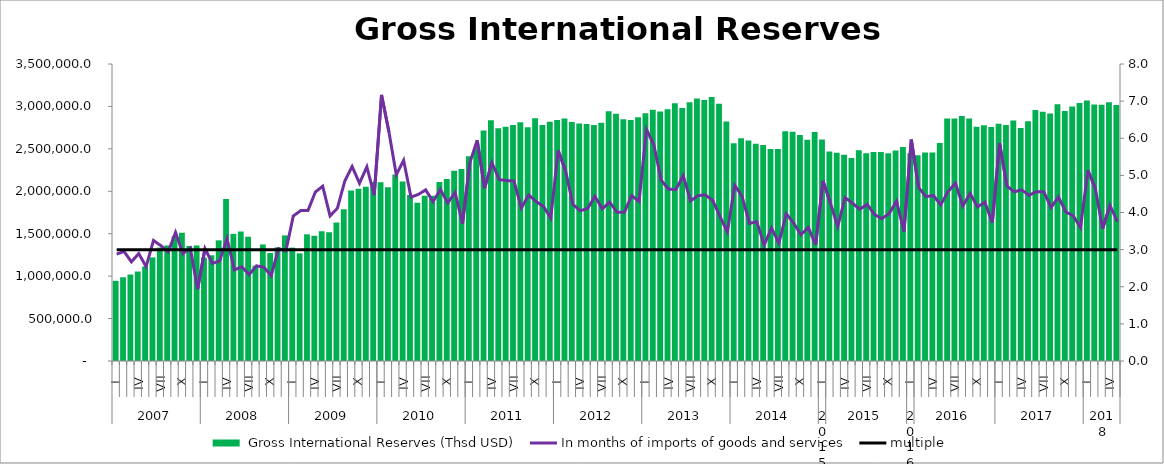
| Category |  Gross International Reserves (Thsd USD) |
|---|---|
| 0 | 944569.356 |
| 1 | 986716.087 |
| 2 | 1018970.638 |
| 3 | 1054278.365 |
| 4 | 1114160.468 |
| 5 | 1220729.487 |
| 6 | 1336062.499 |
| 7 | 1360970.198 |
| 8 | 1469799.647 |
| 9 | 1510431.083 |
| 10 | 1355160.588 |
| 11 | 1361139.94 |
| 12 | 1218380.992 |
| 13 | 1245880.818 |
| 14 | 1421919.99 |
| 15 | 1910253.845 |
| 16 | 1497582.718 |
| 17 | 1526134.644 |
| 18 | 1464749.428 |
| 19 | 1122855.834 |
| 20 | 1373330.153 |
| 21 | 1272102.001 |
| 22 | 1339757.483 |
| 23 | 1480157.563 |
| 24 | 1335830.434 |
| 25 | 1269325.862 |
| 26 | 1493108.058 |
| 27 | 1476027.716 |
| 28 | 1530375.506 |
| 29 | 1518203.703 |
| 30 | 1632579.525 |
| 31 | 1788341.435 |
| 32 | 2009955.589 |
| 33 | 2030508.619 |
| 34 | 2052635.598 |
| 35 | 2110413.479 |
| 36 | 2106203.981 |
| 37 | 2046269.085 |
| 38 | 2199234.144 |
| 39 | 2116174.036 |
| 40 | 1957092.26 |
| 41 | 1864408.87 |
| 42 | 1947257.286 |
| 43 | 1948646.735 |
| 44 | 2110240.516 |
| 45 | 2143452.411 |
| 46 | 2243098.08 |
| 47 | 2263931.003 |
| 48 | 2413276.234 |
| 49 | 2519379.834 |
| 50 | 2717701.26 |
| 51 | 2838315.136 |
| 52 | 2741576.745 |
| 53 | 2759253.793 |
| 54 | 2782237.942 |
| 55 | 2813452.719 |
| 56 | 2755211.768 |
| 57 | 2861887.778 |
| 58 | 2780195.98 |
| 59 | 2818259.268 |
| 60 | 2839594.988 |
| 61 | 2856750.893 |
| 62 | 2816704.829 |
| 63 | 2798459.455 |
| 64 | 2793387.554 |
| 65 | 2780985.069 |
| 66 | 2807413.792 |
| 67 | 2943749.499 |
| 68 | 2914658.817 |
| 69 | 2849332.726 |
| 70 | 2841471.603 |
| 71 | 2872974.007 |
| 72 | 2920913.483 |
| 73 | 2960164.648 |
| 74 | 2941281.374 |
| 75 | 2967640.231 |
| 76 | 3038439.423 |
| 77 | 2981696.572 |
| 78 | 3048940.273 |
| 79 | 3094880.401 |
| 80 | 3074514.403 |
| 81 | 3110052.596 |
| 82 | 3030762.59 |
| 83 | 2823422.31 |
| 84 | 2566485.807 |
| 85 | 2625815.897 |
| 86 | 2598611.489 |
| 87 | 2561530.614 |
| 88 | 2546888.469 |
| 89 | 2498141.455 |
| 90 | 2499536.21 |
| 91 | 2707900.374 |
| 92 | 2701161.577 |
| 93 | 2661929.063 |
| 94 | 2607504.967 |
| 95 | 2699187.561 |
| 96 | 2610108.469 |
| 97 | 2469434.991 |
| 98 | 2452879.825 |
| 99 | 2430898.174 |
| 100 | 2393461.564 |
| 101 | 2483749.819 |
| 102 | 2447135.694 |
| 103 | 2463246.038 |
| 104 | 2464305.635 |
| 105 | 2448949.349 |
| 106 | 2479433.026 |
| 107 | 2520576.458 |
| 108 | 2447473.906 |
| 109 | 2425874.122 |
| 110 | 2456678.704 |
| 111 | 2456757.547 |
| 112 | 2569385.763 |
| 113 | 2857243.993 |
| 114 | 2856372.165 |
| 115 | 2888476.122 |
| 116 | 2858235.696 |
| 117 | 2760196.146 |
| 118 | 2779157.145 |
| 119 | 2757417.107 |
| 120 | 2797144.593 |
| 121 | 2781130.045 |
| 122 | 2832873.183 |
| 123 | 2745865.823 |
| 124 | 2826021.753 |
| 125 | 2956463.581 |
| 126 | 2938356.066 |
| 127 | 2915223.788 |
| 128 | 3025040.952 |
| 129 | 2945349.028 |
| 130 | 2999154.228 |
| 131 | 3038994.561 |
| 132 | 3069440.177 |
| 133 | 3022556.548 |
| 134 | 3019418.473 |
| 135 | 3049424.102 |
| 136 | 3015678.434 |